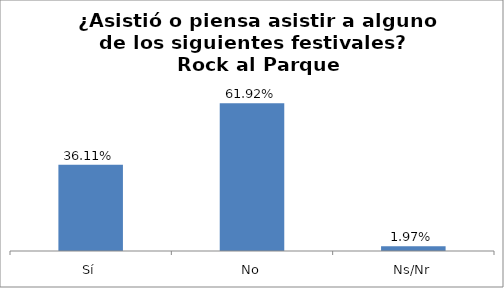
| Category | Total |
|---|---|
| Sí | 0.361 |
| No | 0.619 |
| Ns/Nr | 0.02 |